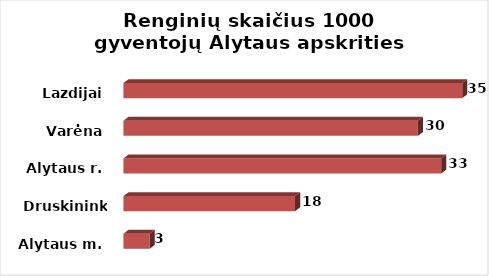
| Category | Series 0 |
|---|---|
| Alytaus m. | 2.7 |
| Druskininkai | 17.651 |
| Alytaus r. | 32.675 |
| Varėna | 30.282 |
| Lazdijai | 34.83 |